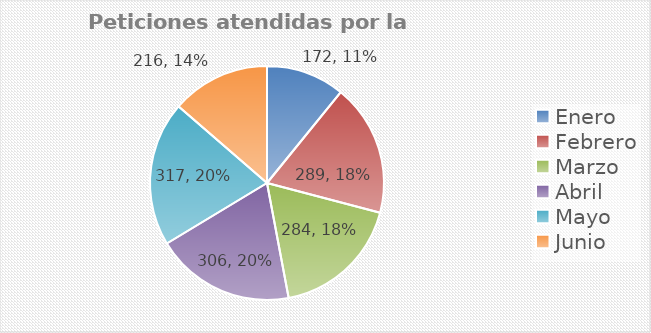
| Category | Series 0 |
|---|---|
| Enero | 172 |
| Febrero | 289 |
| Marzo | 284 |
| Abril | 306 |
| Mayo | 317 |
| Junio | 216 |